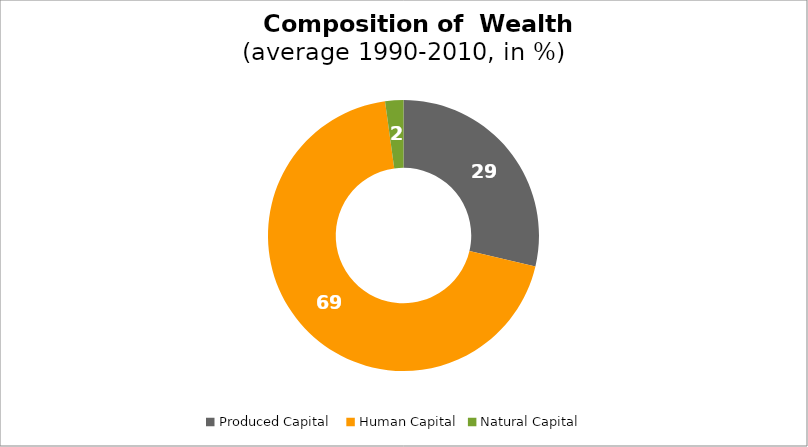
| Category | Series 0 |
|---|---|
| Produced Capital  | 28.679 |
| Human Capital | 69.144 |
| Natural Capital | 2.178 |